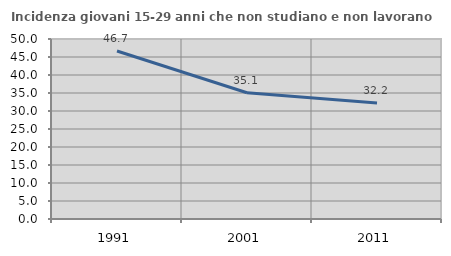
| Category | Incidenza giovani 15-29 anni che non studiano e non lavorano  |
|---|---|
| 1991.0 | 46.671 |
| 2001.0 | 35.058 |
| 2011.0 | 32.223 |